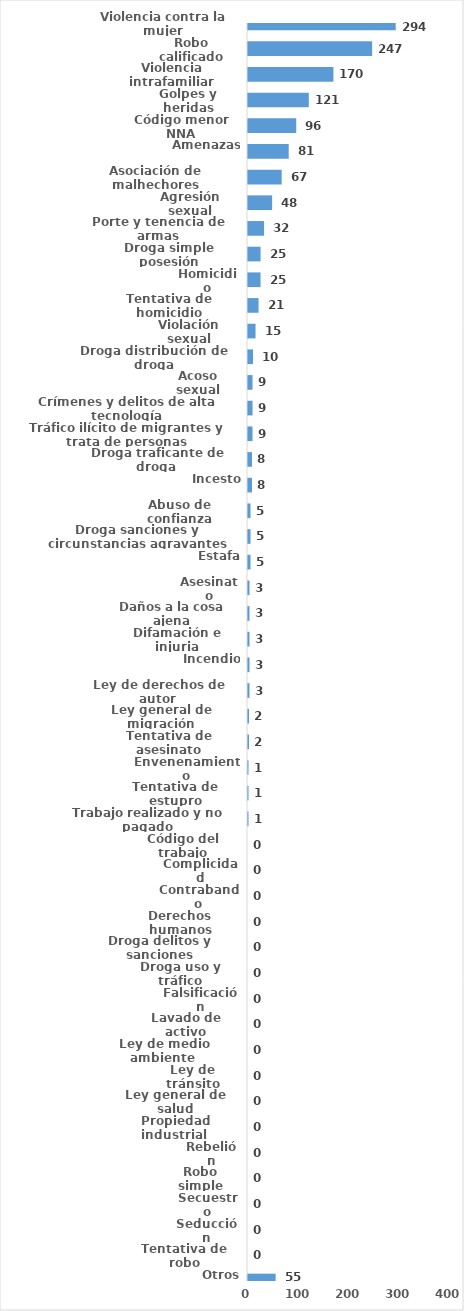
| Category | Series 0 |
|---|---|
| Violencia contra la mujer | 294 |
| Robo calificado | 247 |
| Violencia intrafamiliar | 170 |
| Golpes y heridas | 121 |
| Código menor NNA | 96 |
| Amenazas | 81 |
| Asociación de malhechores | 67 |
| Agresión sexual | 48 |
| Porte y tenencia de armas | 32 |
| Droga simple posesión | 25 |
| Homicidio | 25 |
| Tentativa de homicidio | 21 |
| Violación sexual | 15 |
| Droga distribución de droga | 10 |
| Acoso sexual | 9 |
| Crímenes y delitos de alta tecnología | 9 |
| Tráfico ilícito de migrantes y trata de personas | 9 |
| Droga traficante de droga  | 8 |
| Incesto | 8 |
| Abuso de confianza | 5 |
| Droga sanciones y circunstancias agravantes | 5 |
| Estafa | 5 |
| Asesinato | 3 |
| Daños a la cosa ajena | 3 |
| Difamación e injuria | 3 |
| Incendio | 3 |
| Ley de derechos de autor  | 3 |
| Ley general de migración | 2 |
| Tentativa de asesinato | 2 |
| Envenenamiento | 1 |
| Tentativa de estupro | 1 |
| Trabajo realizado y no pagado | 1 |
| Código del trabajo | 0 |
| Complicidad | 0 |
| Contrabando | 0 |
| Derechos humanos | 0 |
| Droga delitos y sanciones | 0 |
| Droga uso y tráfico | 0 |
| Falsificación | 0 |
| Lavado de activo | 0 |
| Ley de medio ambiente  | 0 |
| Ley de tránsito | 0 |
| Ley general de salud | 0 |
| Propiedad industrial  | 0 |
| Rebelión | 0 |
| Robo simple | 0 |
| Secuestro | 0 |
| Seducción | 0 |
| Tentativa de robo | 0 |
| Otros | 55 |